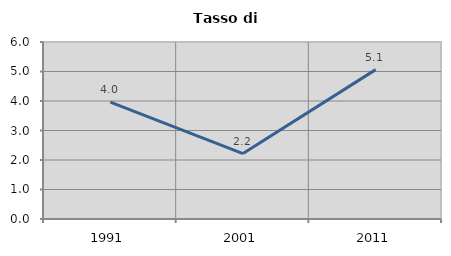
| Category | Tasso di disoccupazione   |
|---|---|
| 1991.0 | 3.965 |
| 2001.0 | 2.217 |
| 2011.0 | 5.063 |